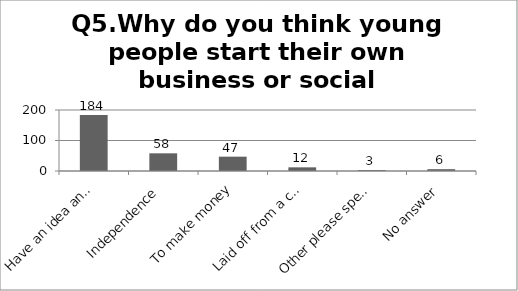
| Category | Q5.Why do you think young people start their own business or social enterprise? |
|---|---|
| Have an idea and want to see it in action | 184 |
| Independence | 58 |
| To make money | 47 |
| Laid off from a company/unemployed | 12 |
| Other please specify | 3 |
| No answer | 6 |